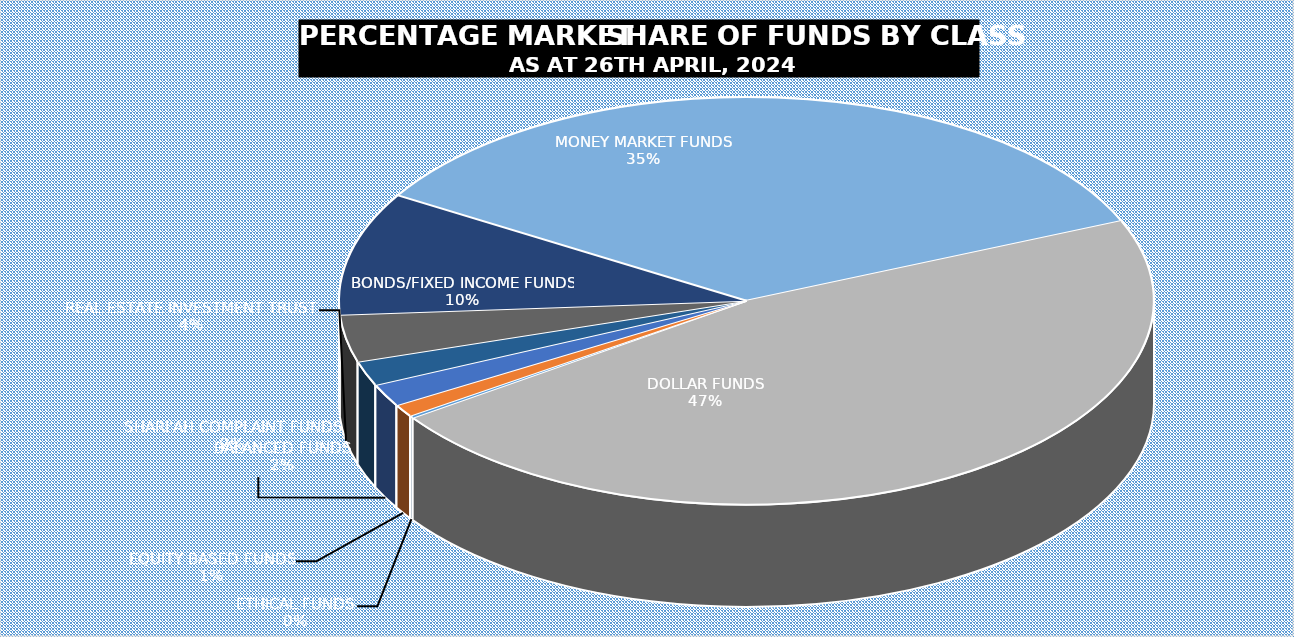
| Category | 26-Apr |
|---|---|
| ETHICAL FUNDS | 4722955841.58 |
| EQUITY BASED FUNDS | 26264049012.868 |
| BALANCED FUNDS | 47381646798.601 |
| SHARI'AH COMPLAINT FUNDS | 51625845610.938 |
| REAL ESTATE INVESTMENT TRUST | 100037877390.685 |
| BONDS/FIXED INCOME FUNDS | 259455612091.819 |
| MONEY MARKET FUNDS | 929998159930.673 |
| DOLLAR FUNDS | 1242707828226.418 |